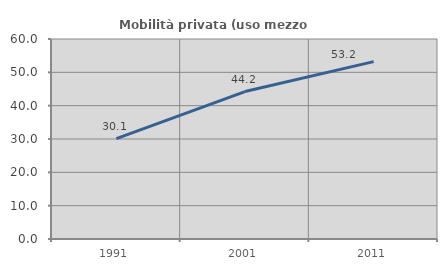
| Category | Mobilità privata (uso mezzo privato) |
|---|---|
| 1991.0 | 30.097 |
| 2001.0 | 44.228 |
| 2011.0 | 53.223 |